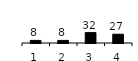
| Category | Series 0 |
|---|---|
| 1.0 | 8 |
| 2.0 | 8 |
| 3.0 | 32 |
| 4.0 | 27 |